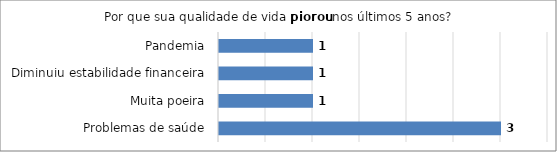
| Category | Series 0 |
|---|---|
| Problemas de saúde | 3 |
| Muita poeira | 1 |
| Diminuiu estabilidade financeira | 1 |
| Pandemia | 1 |